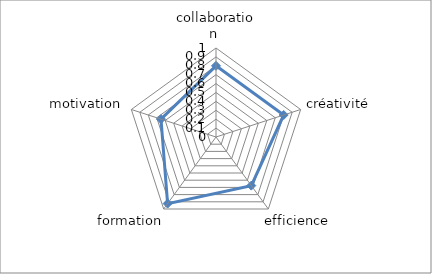
| Category | Series 0 |
|---|---|
| collaboration  | 0.8 |
| créativité | 0.8 |
| efficience | 0.675 |
| formation | 0.925 |
| motivation | 0.65 |